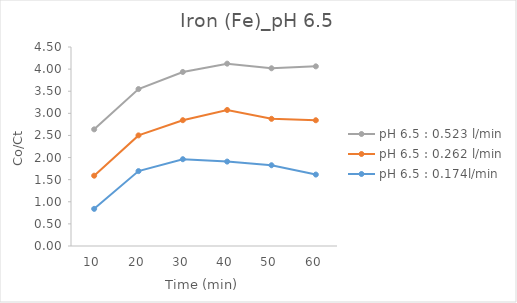
| Category | pH 6.5 : 0.174l/min | pH 6.5 : 0.262 l/min | pH 6.5 : 0.523 l/min |
|---|---|---|---|
| 10.0 | 0.84 | 0.75 | 1.048 |
| 20.0 | 1.694 | 0.808 | 1.048 |
| 30.0 | 1.963 | 0.882 | 1.09 |
| 40.0 | 1.909 | 1.167 | 1.048 |
| 50.0 | 1.826 | 1.05 | 1.143 |
| 60.0 | 1.615 | 1.228 | 1.219 |